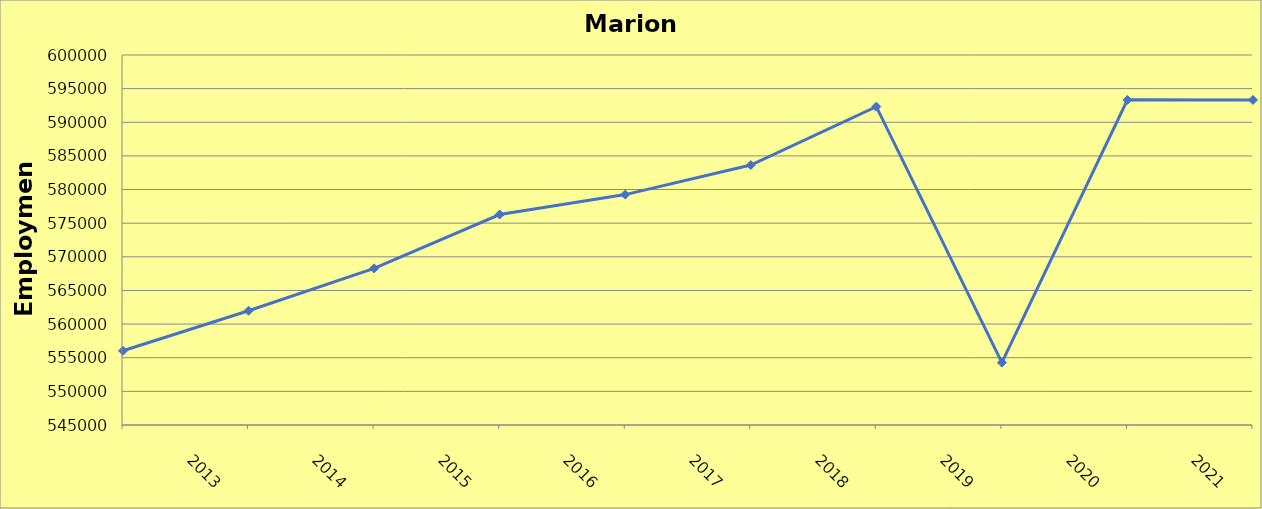
| Category | Marion County |
|---|---|
| 2013.0 | 556030 |
| 2014.0 | 561980 |
| 2015.0 | 568280 |
| 2016.0 | 576290 |
| 2017.0 | 579250 |
| 2018.0 | 583640 |
| 2019.0 | 592320 |
| 2020.0 | 554270 |
| 2021.0 | 593330 |
| 2022.0 | 593311 |